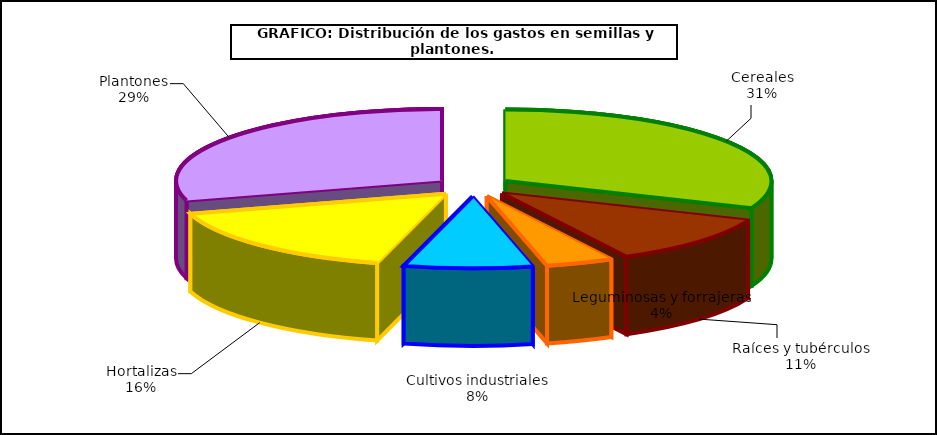
| Category | Series 0 |
|---|---|
| 0 | 288.234 |
| 1 | 102.1 |
| 2 | 38.038 |
| 3 | 72.087 |
| 4 | 150.977 |
| 5 | 272.542 |